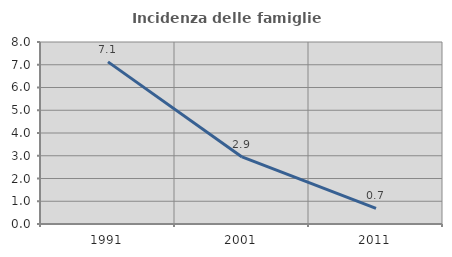
| Category | Incidenza delle famiglie numerose |
|---|---|
| 1991.0 | 7.126 |
| 2001.0 | 2.949 |
| 2011.0 | 0.691 |